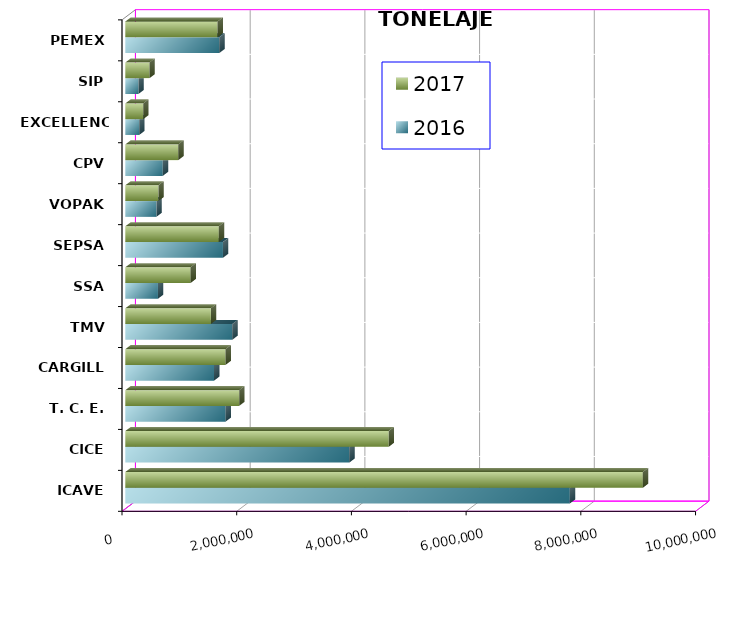
| Category | 2016 | 2017 |
|---|---|---|
| ICAVE | 7750459.991 | 9023905.304 |
| CICE | 3906565.832 | 4592782.782 |
| T. C. E. | 1748925.504 | 1986072.438 |
| CARGILL | 1546658.885 | 1747558.525 |
| TMV | 1866374.315 | 1492104.141 |
| SSA | 569222.715 | 1137749.482 |
| SEPSA | 1702473.254 | 1630476.92 |
| VOPAK | 542231.786 | 576874.489 |
| CPV | 653129.396 | 923664.04 |
| EXCELLENCE | 242842.701 | 312266.757 |
| SIP | 229332.03 | 421251.65 |
| PEMEX | 1639362.098 | 1607805.391 |